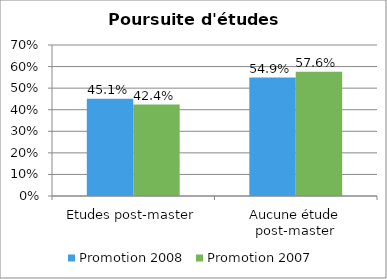
| Category | Promotion 2008 | Promotion 2007 |
|---|---|---|
| Etudes post-master | 0.451 | 0.424 |
| Aucune étude post-master | 0.549 | 0.576 |